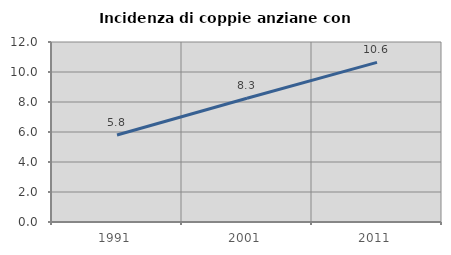
| Category | Incidenza di coppie anziane con figli |
|---|---|
| 1991.0 | 5.801 |
| 2001.0 | 8.251 |
| 2011.0 | 10.638 |